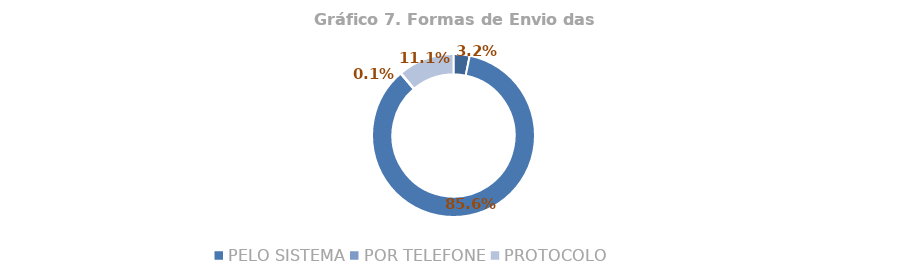
| Category | Total |
|---|---|
| (vazio) | 0.032 |
| PELO SISTEMA | 0.856 |
| POR TELEFONE | 0.001 |
| PROTOCOLO | 0.111 |